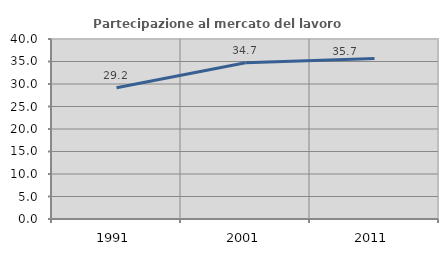
| Category | Partecipazione al mercato del lavoro  femminile |
|---|---|
| 1991.0 | 29.167 |
| 2001.0 | 34.728 |
| 2011.0 | 35.666 |